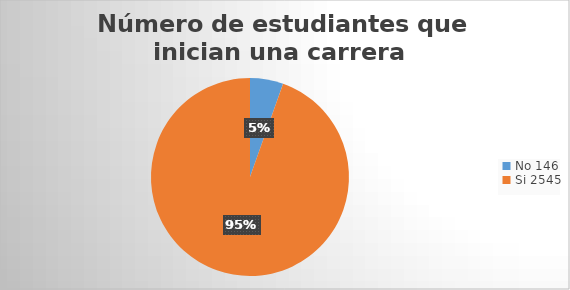
| Category | Número de estudiantes que inician una carrera | Total Porcentual |
|---|---|---|
| 0 | 146 | 0.945 |
| 1 | 2545 | 0.055 |